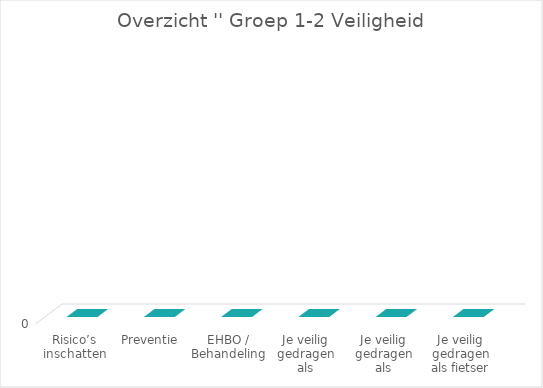
| Category | Series 2 |
|---|---|
| Risico’s inschatten | 0 |
| Preventie | 0 |
| EHBO / Behandeling | 0 |
| Je veilig gedragen als passagier | 0 |
| Je veilig gedragen als voetganger | 0 |
| Je veilig gedragen als fietser | 0 |